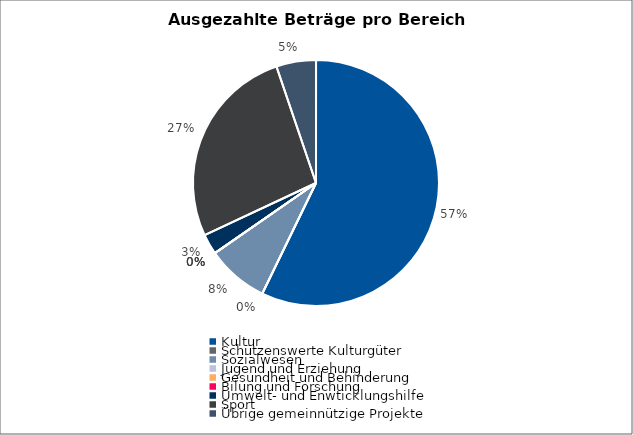
| Category | Series 0 |
|---|---|
| Kultur | 12794197 |
| Schützenswerte Kulturgüter | 0 |
| Sozialwesen | 1822238 |
| Jugend und Erziehung | 0 |
| Gesundheit und Behinderung | 0 |
| Bilung und Forschung | 0 |
| Umwelt- und Enwticklungshilfe | 600000 |
| Sport | 5985965 |
| Übrige gemeinnützige Projekte | 1167460 |